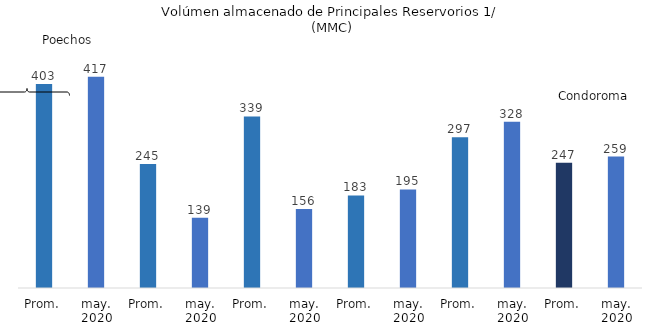
| Category | Series 0 |
|---|---|
| Prom. | 402.7 |
| may. 2020 | 417 |
| Prom. | 244.8 |
| may. 2020 | 138.7 |
| Prom. | 338.5 |
| may. 2020 | 155.7 |
| Prom. | 182.6 |
| may. 2020 | 194.5 |
| Prom. | 297.462 |
| may. 2020 | 328.23 |
| Prom. | 247.14 |
| may. 2020 | 259.38 |